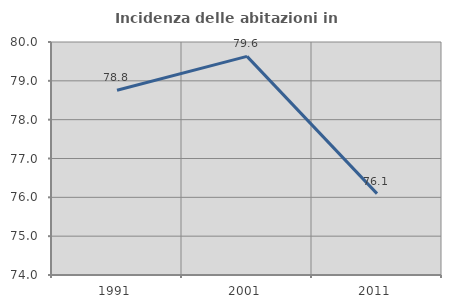
| Category | Incidenza delle abitazioni in proprietà  |
|---|---|
| 1991.0 | 78.756 |
| 2001.0 | 79.63 |
| 2011.0 | 76.096 |